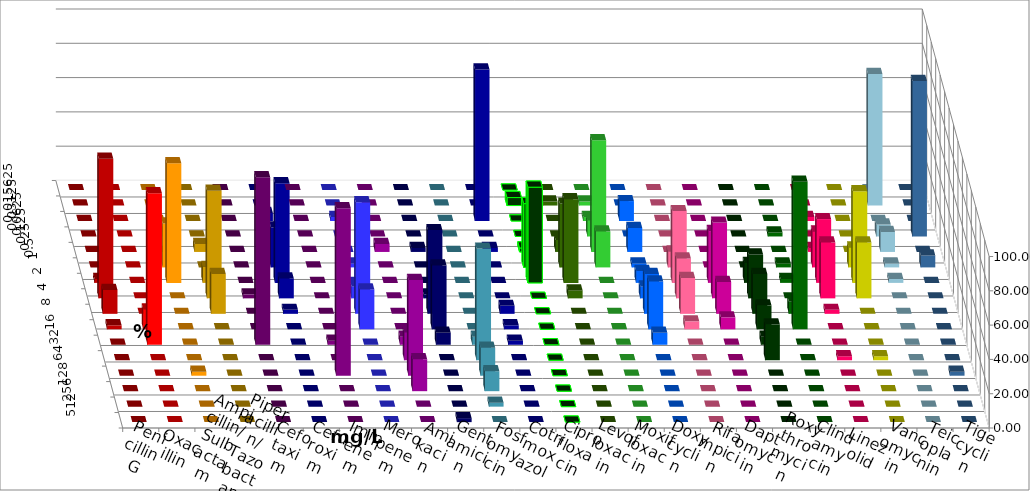
| Category | Penicillin G | Oxacillin | Ampicillin/ Sulbactam | Piperacillin/ Tazobactam | Cefotaxim | Cefuroxim | Imipenem | Meropenem | Amikacin | Gentamicin | Fosfomycin | Cotrimoxazol | Ciprofloxacin | Levofloxacin | Moxifloxacin | Doxycyclin | Rifampicin | Daptomycin | Roxythromycin | Clindamycin | Linezolid | Vancomycin | Teicoplanin | Tigecyclin |
|---|---|---|---|---|---|---|---|---|---|---|---|---|---|---|---|---|---|---|---|---|---|---|---|---|
| 0.015625 | 0 | 0 | 0 | 0 | 0 | 0 | 0 | 0 | 0 | 0 | 0 | 0 | 0 | 0 | 0 | 0 | 0 | 0 | 0 | 0 | 0 | 0 | 0 | 0 |
| 0.03125 | 0 | 0 | 0 | 0 | 0 | 0 | 0 | 0 | 0 | 0 | 0 | 0 | 4.651 | 2.326 | 2.326 | 0 | 0 | 0 | 0 | 0 | 0 | 0 | 0 | 76.744 |
| 0.0625 | 0 | 0 | 0 | 0 | 0 | 0 | 4.651 | 2.326 | 0 | 0 | 0 | 88.372 | 0 | 0 | 2.326 | 11.628 | 0 | 0 | 0 | 0 | 2.326 | 0 | 0 | 0 |
| 0.125 | 0 | 0 | 2.326 | 0 | 0 | 0 | 0 | 0 | 0 | 0 | 0 | 0 | 0 | 0 | 9.302 | 0 | 0 | 0 | 0 | 2.326 | 0 | 0 | 90.698 | 6.977 |
| 0.25 | 0 | 0 | 0 | 4.651 | 0 | 0 | 0 | 0 | 4.651 | 2.326 | 0 | 2.326 | 2.326 | 6.977 | 65.116 | 13.953 | 0 | 0 | 0 | 0 | 2.326 | 0 | 0 | 11.628 |
| 0.5 | 0 | 0 | 25.581 | 0 | 0 | 0 | 23.256 | 2.326 | 0 | 0 | 0 | 0 | 37.209 | 37.209 | 20.93 | 2.326 | 9.302 | 0 | 0 | 2.326 | 20.93 | 11.628 | 6.977 | 2.326 |
| 1.0 | 2.326 | 0 | 69.767 | 9.302 | 0 | 0 | 58.14 | 0 | 0 | 0 | 0 | 0 | 55.814 | 48.837 | 0 | 6.977 | 41.86 | 30.233 | 11.628 | 2.326 | 37.209 | 53.488 | 0 | 2.326 |
| 2.0 | 81.395 | 0 | 0 | 62.791 | 2.326 | 0 | 11.628 | 6.977 | 0 | 2.326 | 0 | 0 | 0 | 4.651 | 0 | 6.977 | 23.256 | 44.186 | 25.581 | 0 | 32.558 | 32.558 | 0 | 0 |
| 4.0 | 13.953 | 0 | 0 | 23.256 | 0 | 0 | 2.326 | 65.116 | 0 | 48.837 | 0 | 4.651 | 0 | 0 | 0 | 23.256 | 20.93 | 18.605 | 23.256 | 6.977 | 2.326 | 0 | 0 | 0 |
| 8.0 | 2.326 | 11.628 | 0 | 0 | 0 | 0 | 0 | 23.256 | 0 | 37.209 | 0 | 2.326 | 0 | 0 | 0 | 27.907 | 4.651 | 6.977 | 13.953 | 86.047 | 0 | 0 | 0 | 0 |
| 16.0 | 0 | 88.372 | 0 | 0 | 97.674 | 2.326 | 0 | 0 | 4.651 | 6.977 | 4.651 | 2.326 | 0 | 0 | 0 | 6.977 | 0 | 0 | 4.651 | 0 | 0 | 0 | 0 | 0 |
| 32.0 | 0 | 0 | 0 | 0 | 0 | 0 | 0 | 0 | 16.279 | 0 | 65.116 | 0 | 0 | 0 | 0 | 0 | 0 | 0 | 20.93 | 0 | 2.326 | 2.326 | 0 | 0 |
| 64.0 | 0 | 0 | 2.326 | 0 | 0 | 97.674 | 0 | 0 | 55.814 | 0 | 16.279 | 0 | 0 | 0 | 0 | 0 | 0 | 0 | 0 | 0 | 0 | 0 | 2.326 | 0 |
| 128.0 | 0 | 0 | 0 | 0 | 0 | 0 | 0 | 0 | 18.605 | 0 | 11.628 | 0 | 0 | 0 | 0 | 0 | 0 | 0 | 0 | 0 | 0 | 0 | 0 | 0 |
| 256.0 | 0 | 0 | 0 | 0 | 0 | 0 | 0 | 0 | 0 | 0 | 2.326 | 0 | 0 | 0 | 0 | 0 | 0 | 0 | 0 | 0 | 0 | 0 | 0 | 0 |
| 512.0 | 0 | 0 | 0 | 0 | 0 | 0 | 0 | 0 | 0 | 2.326 | 0 | 0 | 0 | 0 | 0 | 0 | 0 | 0 | 0 | 0 | 0 | 0 | 0 | 0 |